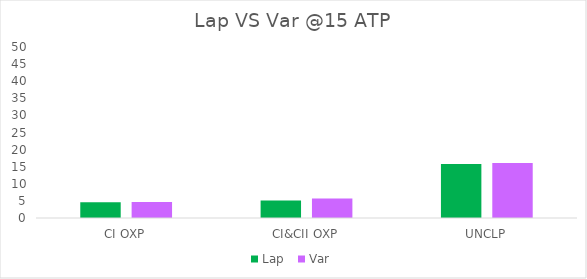
| Category | Lap  | Var |
|---|---|---|
| CI OXP | 4.585 | 4.692 |
| CI&CII OXP | 5.151 | 5.736 |
| UNCLP | 15.795 | 16.071 |